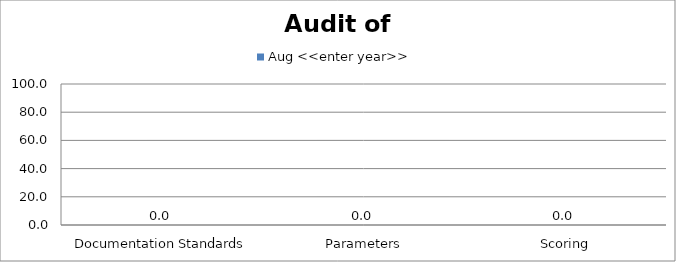
| Category | Aug <<enter year>> |
|---|---|
|  Documentation Standards | 0 |
|  Parameters | 0 |
|  Scoring | 0 |